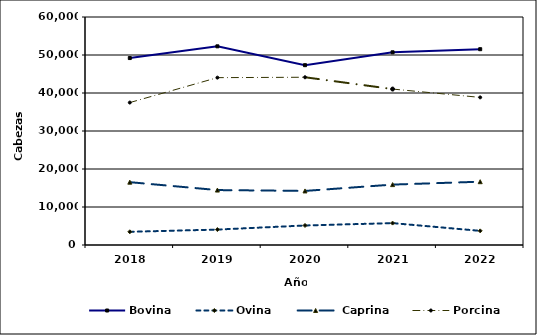
| Category | Bovina | Ovina |  Caprina | Porcina |
|---|---|---|---|---|
| 2018.0 | 49195 | 3474 | 16535 | 37480 |
| 2019.0 | 52280 | 4060 | 14455 | 44042 |
| 2020.0 | 47321 | 5139 | 14229 | 44146 |
| 2021.0 | 50709 | 5762 | 15896 | 41038 |
| 2022.0 | 51529 | 3719 | 16658 | 38845 |